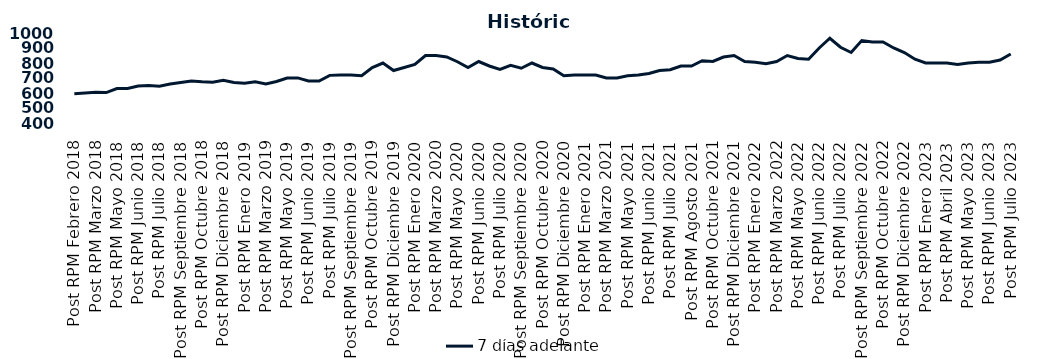
| Category | 7 días adelante  |
|---|---|
| Post RPM Febrero 2018 | 595 |
| Pre RPM Marzo 2018 | 600 |
| Post RPM Marzo 2018 | 605 |
| Pre RPM Mayo 2018 | 603 |
| Post RPM Mayo 2018 | 630 |
| Pre RPM Junio 2018 | 630 |
| Post RPM Junio 2018 | 646.5 |
| Pre RPM Julio 2018 | 650 |
| Post RPM Julio 2018 | 645 |
| Pre RPM Septiembre 2018 | 660 |
| Post RPM Septiembre 2018 | 670 |
| Pre RPM Octubre 2018 | 680 |
| Post RPM Octubre 2018 | 675 |
| Pre RPM Diciembre 2018 | 672.5 |
| Post RPM Diciembre 2018 | 685 |
| Pre RPM Enero 2019 | 670 |
| Post RPM Enero 2019 | 665 |
| Pre RPM Marzo 2019 | 675 |
| Post RPM Marzo 2019 | 661 |
| Pre RPM Mayo 2019 | 677 |
| Post RPM Mayo 2019 | 700 |
| Pre RPM Junio 2019 | 700.5 |
| Post RPM Junio 2019 | 680 |
| Pre RPM Julio 2019 | 680 |
| Post RPM Julio 2019 | 717.5 |
| Pre RPM Septiembre 2019 | 720 |
| Post RPM Septiembre 2019 | 720 |
| Pre RPM Octubre 2019 | 715 |
| Post RPM Octubre 2019 | 770 |
| Pre RPM Diciembre 2019 | 800 |
| Post RPM Diciembre 2019 | 750 |
| Pre RPM Enero 2020 | 770 |
| Post RPM Enero 2020 | 790 |
| Pre RPM Marzo 2020 | 850 |
| Post RPM Marzo 2020 | 850 |
| Pre RPM Mayo 2020 | 840 |
| Post RPM Mayo 2020 | 808.5 |
| Pre RPM Junio 2020 | 770 |
| Post RPM Junio 2020 | 810 |
| Pre RPM Julio 2020 | 780 |
| Post RPM Julio 2020 | 757 |
| Pre RPM Septiembre 2020 | 785 |
| Post RPM Septiembre 2020 | 765 |
| Pre RPM Octubre 2020 | 800 |
| Post RPM Octubre 2020 | 770 |
| Pre RPM Diciembre 2020 | 760 |
| Post RPM Diciembre 2020 | 715 |
| Pre RPM Enero 2021 | 720 |
| Post RPM Enero 2021 | 720 |
| Pre RPM Marzo 2021 | 720 |
| Post RPM Marzo 2021 | 700 |
| Pre RPM Mayo 2021 | 700 |
| Post RPM Mayo 2021 | 715 |
| Pre RPM Junio 2021 | 720 |
| Post RPM Junio 2021 | 730 |
| Pre RPM Julio 2021 | 750 |
| Post RPM Julio 2021 | 755 |
| Pre RPM Agosto 2021 | 780 |
| Post RPM Agosto 2021 | 780 |
| Pre RPM Octubre 2021 | 815 |
| Post RPM Octubre 2021 | 810 |
| Pre RPM Diciembre 2021 | 840 |
| Post RPM Diciembre 2021 | 850 |
| Pre RPM Enero 2022 | 810 |
| Post RPM Enero 2022 | 805 |
| Pre RPM Marzo 2022 | 795 |
| Post RPM Marzo 2022 | 810 |
| Pre RPM Mayo 2022 | 850 |
| Post RPM Mayo 2022 | 830 |
| Pre RPM Junio 2022 | 825 |
| Post RPM Junio 2022 | 900 |
| Pre RPM Julio 2022 | 965 |
| Post RPM Julio 2022 | 905 |
| Pre RPM Septiembre 2022 | 870 |
| Post RPM Septiembre 2022 | 950 |
| Pre RPM Octubre 2022 | 940 |
| Post RPM Octubre 2022 | 940 |
| Pre RPM Diciembre 2022 | 900 |
| Post RPM Diciembre 2022 | 870 |
| Pre RPM Enero 2023 | 825 |
| Post RPM Enero 2023 | 800 |
| Pre RPM Abril 2023 | 800 |
| Post RPM Abril 2023 | 800 |
| Pre RPM Mayo 2023 | 790 |
| Post RPM Mayo 2023 | 800 |
| Pre RPM Junio 2023 | 805 |
| Post RPM Junio 2023 | 805 |
| Pre RPM Julio 2023 | 820 |
| Post RPM Julio 2023 | 860 |